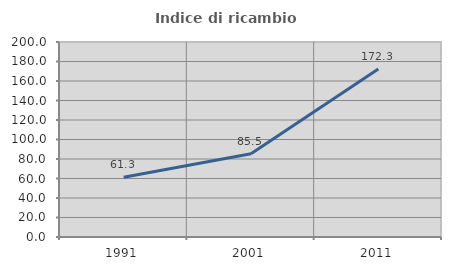
| Category | Indice di ricambio occupazionale  |
|---|---|
| 1991.0 | 61.314 |
| 2001.0 | 85.484 |
| 2011.0 | 172.321 |